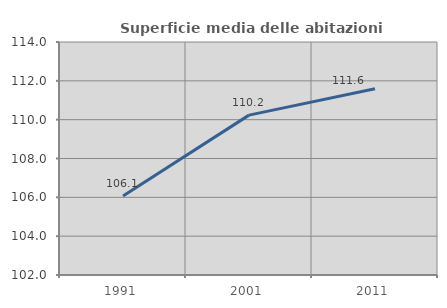
| Category | Superficie media delle abitazioni occupate |
|---|---|
| 1991.0 | 106.071 |
| 2001.0 | 110.234 |
| 2011.0 | 111.588 |